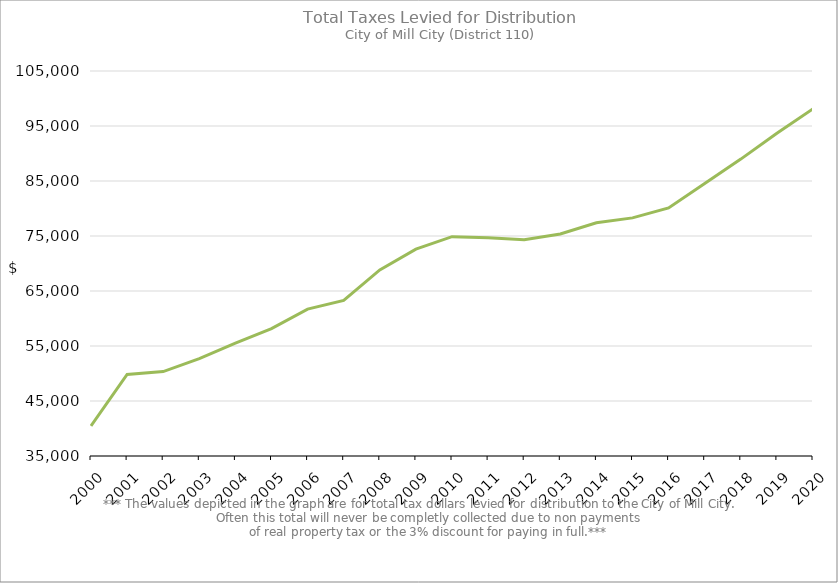
| Category | Series 0 |
|---|---|
| 2000.0 | 40485.18 |
| 2001.0 | 49818.98 |
| 2002.0 | 50342.97 |
| 2003.0 | 52702.25 |
| 2004.0 | 55522.42 |
| 2005.0 | 58149.33 |
| 2006.0 | 61709.59 |
| 2007.0 | 63278.31 |
| 2008.0 | 68832.65 |
| 2009.0 | 72610.65 |
| 2010.0 | 74871.6 |
| 2011.0 | 74668.95 |
| 2012.0 | 74323.9 |
| 2013.0 | 75372.81 |
| 2014.0 | 77402.29 |
| 2015.0 | 78295.72 |
| 2016.0 | 80092.58 |
| 2017.0 | 84541.84 |
| 2018.0 | 88981.36 |
| 2019.0 | 93673.91 |
| 2020.0 | 98125.97 |